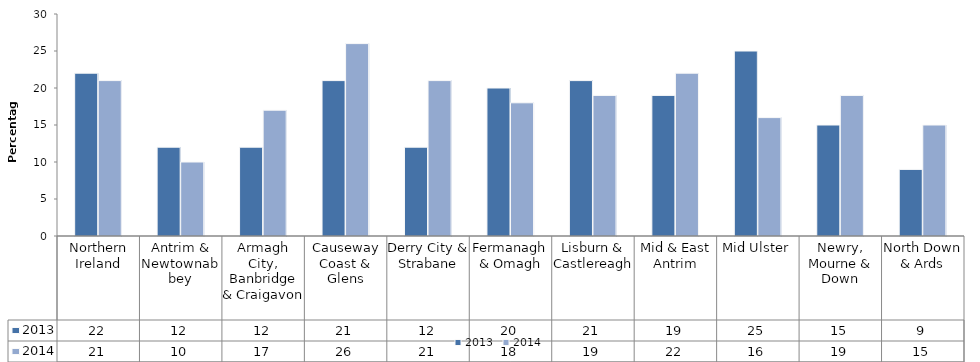
| Category | 2013 | 2014 |
|---|---|---|
| Northern Ireland | 22 | 21 |
| Antrim & Newtownabbey | 12 | 10 |
| Armagh City, Banbridge & Craigavon | 12 | 17 |
| Causeway Coast & Glens | 21 | 26 |
| Derry City & Strabane | 12 | 21 |
| Fermanagh & Omagh | 20 | 18 |
| Lisburn & Castlereagh | 21 | 19 |
| Mid & East Antrim | 19 | 22 |
| Mid Ulster | 25 | 16 |
| Newry, Mourne & Down | 15 | 19 |
| North Down & Ards | 9 | 15 |